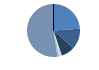
| Category | Series 0 |
|---|---|
| ARRASTRE | 330 |
| CERCO | 175 |
| PALANGRE | 116 |
| REDES DE ENMALLE | 23 |
| ARTES FIJAS | 14 |
| ARTES MENORES | 723 |
| SIN TIPO ASIGNADO | 0 |